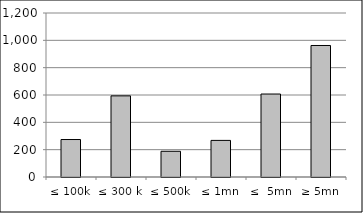
| Category | Series 0 |
|---|---|
| ≤ 100k | 274180363.955 |
| ≤ 300 k | 593659236.273 |
| ≤ 500k | 188077504.03 |
| ≤ 1mn | 267817417.513 |
| ≤  5mn | 607190735.25 |
| ≥ 5mn | 962233411.22 |